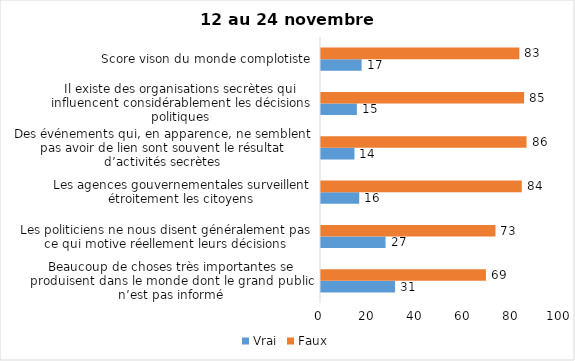
| Category | Vrai | Faux |
|---|---|---|
| Beaucoup de choses très importantes se produisent dans le monde dont le grand public n’est pas informé | 31 | 69 |
| Les politiciens ne nous disent généralement pas ce qui motive réellement leurs décisions | 27 | 73 |
| Les agences gouvernementales surveillent étroitement les citoyens | 16 | 84 |
| Des événements qui, en apparence, ne semblent pas avoir de lien sont souvent le résultat d’activités secrètes | 14 | 86 |
| Il existe des organisations secrètes qui influencent considérablement les décisions politiques | 15 | 85 |
| Score vison du monde complotiste | 17 | 83 |